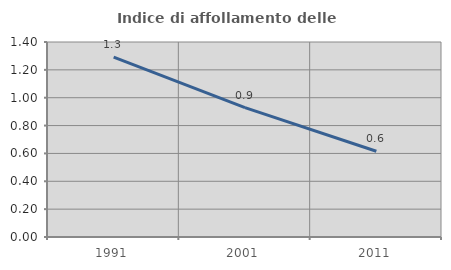
| Category | Indice di affollamento delle abitazioni  |
|---|---|
| 1991.0 | 1.291 |
| 2001.0 | 0.929 |
| 2011.0 | 0.615 |